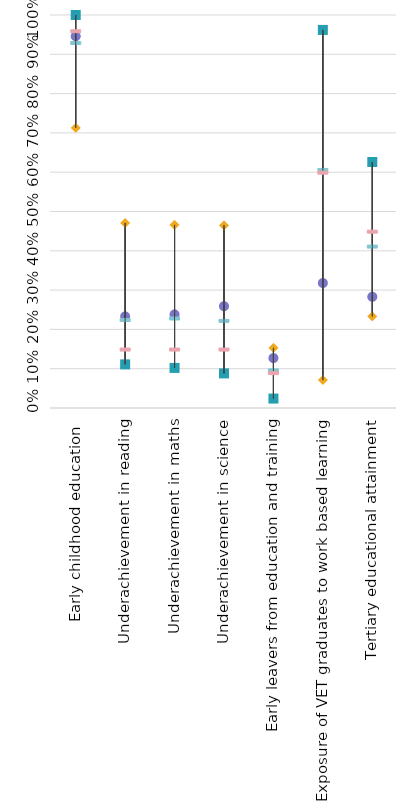
| Category | Italy | Strongest performer | Weakest performer | EU average | EU target |
|---|---|---|---|---|---|
| Early childhood education  | 0.946 | 1 | 0.713 | 0.93 | 0.96 |
| Underachievement in reading | 0.233 | 0.111 | 0.471 | 0.225 | 0.15 |
| Underachievement in maths | 0.238 | 0.102 | 0.466 | 0.229 | 0.15 |
| Underachievement in science | 0.259 | 0.088 | 0.465 | 0.223 | 0.15 |
| Early leavers from education and training | 0.127 | 0.024 | 0.153 | 0.097 | 0.09 |
| Exposure of VET graduates to work based learning  | 0.318 | 0.962 | 0.071 | 0.607 | 0.6 |
| Tertiary educational attainment | 0.283 | 0.626 | 0.233 | 0.412 | 0.45 |